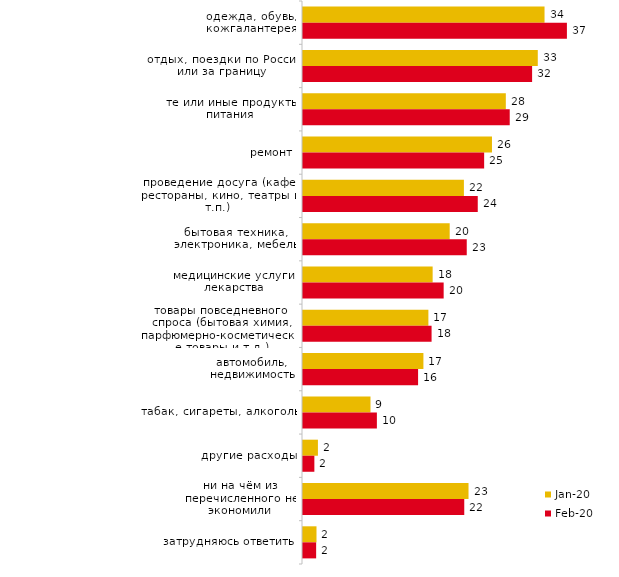
| Category | янв.20 | фев.20 |
|---|---|---|
| одежда, обувь, кожгалантерея | 33.663 | 36.782 |
| отдых, поездки по России или за границу | 32.723 | 31.931 |
| те или иные продукты питания | 28.267 | 28.812 |
| ремонт | 26.337 | 25.248 |
| проведение досуга (кафе, рестораны, кино, театры и т.п.) | 22.426 | 24.356 |
| бытовая техника, электроника, мебель | 20.446 | 22.822 |
| медицинские услуги, лекарства | 18.069 | 19.604 |
| товары повседневного спроса (бытовая химия, парфюмерно-косметические товары и т.д.) | 17.475 | 17.921 |
| автомобиль, недвижимость | 16.782 | 16.04 |
| табак, сигареты, алкоголь | 9.406 | 10.297 |
| другие расходы | 2.079 | 1.584 |
| ни на чём из перечисленного не экономили | 23.069 | 22.475 |
| затрудняюсь ответить | 1.881 | 1.832 |